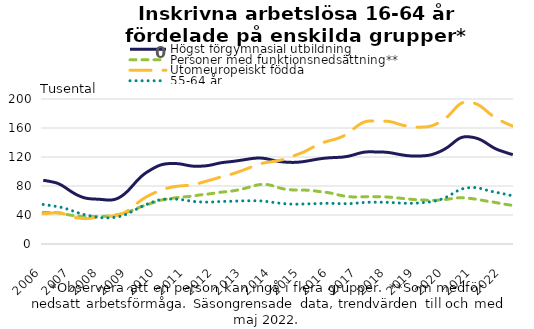
| Category | Högst förgymnasial utbildning | Personer med funktionsnedsättning** | Utomeuropeiskt födda | 55-64 år |
|---|---|---|---|---|
| 2006 | 87.802 | 43.582 | 41.833 | 54.537 |
| 2006-02 | 87.373 | 43.578 | 42.025 | 54.119 |
| 2006-03 | 86.816 | 43.552 | 42.259 | 53.616 |
| 2006-04 | 86.18 | 43.529 | 42.538 | 53.073 |
| 2006-05 | 85.501 | 43.503 | 42.864 | 52.537 |
| 2006-06 | 84.723 | 43.41 | 43.159 | 52.028 |
| 2006-07 | 83.674 | 43.141 | 43.237 | 51.506 |
| 2006-08 | 82.23 | 42.648 | 42.929 | 50.903 |
| 2006-09 | 80.421 | 41.984 | 42.222 | 50.17 |
| 2006-10 | 78.326 | 41.245 | 41.193 | 49.29 |
| 2006-11 | 76.077 | 40.556 | 39.992 | 48.277 |
| 2006-12 | 73.823 | 39.994 | 38.778 | 47.161 |
| 2007 | 71.665 | 39.554 | 37.694 | 45.989 |
| 2007-02 | 69.674 | 39.162 | 36.803 | 44.809 |
| 2007-03 | 67.9 | 38.759 | 36.116 | 43.659 |
| 2007-04 | 66.349 | 38.344 | 35.61 | 42.586 |
| 2007-05 | 65.012 | 37.966 | 35.243 | 41.606 |
| 2007-06 | 63.919 | 37.704 | 35.027 | 40.72 |
| 2007-07 | 63.115 | 37.611 | 35.015 | 39.928 |
| 2007-08 | 62.586 | 37.68 | 35.25 | 39.202 |
| 2007-09 | 62.268 | 37.84 | 35.718 | 38.525 |
| 2007-10 | 62.072 | 38.003 | 36.331 | 37.883 |
| 2007-11 | 61.924 | 38.091 | 36.983 | 37.283 |
| 2007-12 | 61.752 | 38.107 | 37.563 | 36.763 |
| 2008 | 61.51 | 38.112 | 37.986 | 36.371 |
| 2008-02 | 61.203 | 38.171 | 38.219 | 36.126 |
| 2008-03 | 60.872 | 38.317 | 38.299 | 36.021 |
| 2008-04 | 60.631 | 38.546 | 38.31 | 36.034 |
| 2008-05 | 60.62 | 38.854 | 38.379 | 36.154 |
| 2008-06 | 60.946 | 39.244 | 38.6 | 36.389 |
| 2008-07 | 61.681 | 39.736 | 39.031 | 36.757 |
| 2008-08 | 62.883 | 40.344 | 39.71 | 37.294 |
| 2008-09 | 64.557 | 41.073 | 40.658 | 38.033 |
| 2008-10 | 66.697 | 41.917 | 41.911 | 38.99 |
| 2008-11 | 69.277 | 42.866 | 43.5 | 40.17 |
| 2008-12 | 72.261 | 43.908 | 45.428 | 41.546 |
| 2009 | 75.613 | 45.037 | 47.687 | 43.079 |
| 2009-02 | 79.248 | 46.264 | 50.224 | 44.731 |
| 2009-03 | 83.018 | 47.586 | 52.926 | 46.461 |
| 2009-04 | 86.732 | 48.969 | 55.65 | 48.207 |
| 2009-05 | 90.209 | 50.343 | 58.265 | 49.904 |
| 2009-06 | 93.324 | 51.63 | 60.676 | 51.501 |
| 2009-07 | 96.038 | 52.801 | 62.856 | 52.988 |
| 2009-08 | 98.405 | 53.877 | 64.831 | 54.384 |
| 2009-09 | 100.546 | 54.926 | 66.644 | 55.72 |
| 2009-10 | 102.546 | 56.007 | 68.339 | 57.015 |
| 2009-11 | 104.434 | 57.142 | 69.923 | 58.252 |
| 2009-12 | 106.184 | 58.283 | 71.407 | 59.391 |
| 2010 | 107.706 | 59.353 | 72.784 | 60.366 |
| 2010-02 | 108.924 | 60.284 | 74.047 | 61.113 |
| 2010-03 | 109.822 | 61.046 | 75.203 | 61.619 |
| 2010-04 | 110.424 | 61.665 | 76.252 | 61.912 |
| 2010-05 | 110.787 | 62.195 | 77.172 | 62.044 |
| 2010-06 | 110.977 | 62.692 | 77.963 | 62.071 |
| 2010-07 | 111.053 | 63.188 | 78.636 | 62.03 |
| 2010-08 | 111.016 | 63.675 | 79.194 | 61.93 |
| 2010-09 | 110.831 | 64.115 | 79.644 | 61.754 |
| 2010-10 | 110.478 | 64.483 | 80.004 | 61.483 |
| 2010-11 | 109.963 | 64.785 | 80.292 | 61.094 |
| 2010-12 | 109.32 | 65.052 | 80.534 | 60.596 |
| 2011 | 108.638 | 65.324 | 80.762 | 60.036 |
| 2011-02 | 108.016 | 65.638 | 81.035 | 59.48 |
| 2011-03 | 107.541 | 66.019 | 81.423 | 58.981 |
| 2011-04 | 107.271 | 66.47 | 81.989 | 58.576 |
| 2011-05 | 107.194 | 66.963 | 82.751 | 58.281 |
| 2011-06 | 107.253 | 67.453 | 83.66 | 58.085 |
| 2011-07 | 107.387 | 67.894 | 84.636 | 57.951 |
| 2011-08 | 107.581 | 68.279 | 85.621 | 57.853 |
| 2011-09 | 107.877 | 68.646 | 86.583 | 57.792 |
| 2011-10 | 108.315 | 69.036 | 87.512 | 57.784 |
| 2011-11 | 108.913 | 69.466 | 88.428 | 57.853 |
| 2011-12 | 109.646 | 69.937 | 89.362 | 58.005 |
| 2012 | 110.443 | 70.435 | 90.331 | 58.209 |
| 2012-02 | 111.215 | 70.917 | 91.319 | 58.426 |
| 2012-03 | 111.886 | 71.348 | 92.29 | 58.612 |
| 2012-04 | 112.412 | 71.712 | 93.212 | 58.738 |
| 2012-05 | 112.812 | 72.036 | 94.082 | 58.806 |
| 2012-06 | 113.155 | 72.371 | 94.945 | 58.851 |
| 2012-07 | 113.5 | 72.758 | 95.841 | 58.911 |
| 2012-08 | 113.884 | 73.219 | 96.789 | 59.011 |
| 2012-09 | 114.305 | 73.754 | 97.82 | 59.138 |
| 2012-10 | 114.755 | 74.355 | 98.94 | 59.269 |
| 2012-11 | 115.241 | 75.03 | 100.128 | 59.387 |
| 2012-12 | 115.753 | 75.783 | 101.334 | 59.476 |
| 2013 | 116.275 | 76.612 | 102.529 | 59.533 |
| 2013-02 | 116.799 | 77.512 | 103.728 | 59.563 |
| 2013-03 | 117.312 | 78.473 | 104.967 | 59.584 |
| 2013-04 | 117.794 | 79.444 | 106.254 | 59.616 |
| 2013-05 | 118.203 | 80.359 | 107.557 | 59.646 |
| 2013-06 | 118.473 | 81.147 | 108.803 | 59.641 |
| 2013-07 | 118.567 | 81.759 | 109.933 | 59.568 |
| 2013-08 | 118.473 | 82.161 | 110.91 | 59.404 |
| 2013-09 | 118.175 | 82.314 | 111.694 | 59.136 |
| 2013-10 | 117.679 | 82.181 | 112.304 | 58.766 |
| 2013-11 | 117.006 | 81.736 | 112.817 | 58.315 |
| 2013-12 | 116.227 | 81.004 | 113.316 | 57.828 |
| 2014 | 115.441 | 80.063 | 113.855 | 57.362 |
| 2014-02 | 114.722 | 79.009 | 114.432 | 56.937 |
| 2014-03 | 114.115 | 77.961 | 115.034 | 56.552 |
| 2014-04 | 113.634 | 77.022 | 115.686 | 56.192 |
| 2014-05 | 113.264 | 76.254 | 116.438 | 55.853 |
| 2014-06 | 112.984 | 75.664 | 117.329 | 55.541 |
| 2014-07 | 112.774 | 75.214 | 118.371 | 55.274 |
| 2014-08 | 112.627 | 74.865 | 119.544 | 55.073 |
| 2014-09 | 112.566 | 74.601 | 120.818 | 54.96 |
| 2014-10 | 112.608 | 74.413 | 122.127 | 54.937 |
| 2014-11 | 112.756 | 74.306 | 123.402 | 54.975 |
| 2014-12 | 113.017 | 74.275 | 124.646 | 55.049 |
| 2015 | 113.381 | 74.293 | 125.936 | 55.134 |
| 2015-02 | 113.839 | 74.319 | 127.353 | 55.218 |
| 2015-03 | 114.375 | 74.278 | 128.945 | 55.298 |
| 2015-04 | 114.961 | 74.107 | 130.68 | 55.378 |
| 2015-05 | 115.573 | 73.797 | 132.488 | 55.464 |
| 2015-06 | 116.176 | 73.381 | 134.29 | 55.561 |
| 2015-07 | 116.745 | 72.928 | 136.004 | 55.668 |
| 2015-08 | 117.263 | 72.487 | 137.563 | 55.782 |
| 2015-09 | 117.73 | 72.08 | 138.935 | 55.9 |
| 2015-10 | 118.143 | 71.699 | 140.124 | 56.013 |
| 2015-11 | 118.5 | 71.302 | 141.162 | 56.1 |
| 2015-12 | 118.79 | 70.82 | 142.093 | 56.13 |
| 2016 | 119.01 | 70.216 | 142.951 | 56.092 |
| 2016-02 | 119.18 | 69.492 | 143.809 | 56.003 |
| 2016-03 | 119.324 | 68.694 | 144.746 | 55.89 |
| 2016-04 | 119.472 | 67.894 | 145.816 | 55.779 |
| 2016-05 | 119.656 | 67.148 | 147.064 | 55.689 |
| 2016-06 | 119.925 | 66.497 | 148.533 | 55.635 |
| 2016-07 | 120.325 | 65.953 | 150.279 | 55.623 |
| 2016-08 | 120.879 | 65.521 | 152.34 | 55.654 |
| 2016-09 | 121.59 | 65.194 | 154.699 | 55.735 |
| 2016-10 | 122.443 | 64.965 | 157.282 | 55.88 |
| 2016-11 | 123.398 | 64.843 | 159.959 | 56.103 |
| 2016-12 | 124.383 | 64.825 | 162.546 | 56.399 |
| 2017 | 125.308 | 64.89 | 164.862 | 56.727 |
| 2017-02 | 126.087 | 65.013 | 166.771 | 57.045 |
| 2017-03 | 126.657 | 65.153 | 168.187 | 57.318 |
| 2017-04 | 126.996 | 65.266 | 169.113 | 57.514 |
| 2017-05 | 127.133 | 65.327 | 169.609 | 57.628 |
| 2017-06 | 127.132 | 65.347 | 169.779 | 57.676 |
| 2017-07 | 127.067 | 65.342 | 169.739 | 57.681 |
| 2017-08 | 127.007 | 65.324 | 169.62 | 57.673 |
| 2017-09 | 126.965 | 65.296 | 169.519 | 57.662 |
| 2017-10 | 126.904 | 65.24 | 169.458 | 57.637 |
| 2017-11 | 126.78 | 65.133 | 169.409 | 57.592 |
| 2017-12 | 126.565 | 64.963 | 169.322 | 57.523 |
| 2018 | 126.245 | 64.735 | 169.106 | 57.424 |
| 2018-02 | 125.804 | 64.455 | 168.645 | 57.281 |
| 2018-03 | 125.236 | 64.146 | 167.883 | 57.088 |
| 2018-04 | 124.585 | 63.832 | 166.886 | 56.867 |
| 2018-05 | 123.926 | 63.524 | 165.809 | 56.648 |
| 2018-06 | 123.31 | 63.214 | 164.794 | 56.447 |
| 2018-07 | 122.753 | 62.895 | 163.915 | 56.282 |
| 2018-08 | 122.27 | 62.566 | 163.185 | 56.165 |
| 2018-09 | 121.875 | 62.223 | 162.582 | 56.101 |
| 2018-10 | 121.588 | 61.88 | 162.092 | 56.101 |
| 2018-11 | 121.407 | 61.557 | 161.7 | 56.162 |
| 2018-12 | 121.3 | 61.272 | 161.392 | 56.275 |
| 2019 | 121.27 | 61.041 | 161.193 | 56.446 |
| 2019-02 | 121.335 | 60.857 | 161.138 | 56.678 |
| 2019-03 | 121.492 | 60.711 | 161.213 | 56.95 |
| 2019-04 | 121.718 | 60.591 | 161.377 | 57.243 |
| 2019-05 | 122.018 | 60.479 | 161.628 | 57.556 |
| 2019-06 | 122.463 | 60.378 | 162.068 | 57.92 |
| 2019-07 | 123.162 | 60.313 | 162.858 | 58.384 |
| 2019-08 | 124.129 | 60.309 | 164.023 | 58.976 |
| 2019-09 | 125.315 | 60.383 | 165.493 | 59.705 |
| 2019-10 | 126.672 | 60.536 | 167.179 | 60.57 |
| 2019-11 | 128.174 | 60.756 | 169.027 | 61.59 |
| 2019-12 | 129.85 | 61.049 | 171.09 | 62.798 |
| 2020 | 131.762 | 61.417 | 173.493 | 64.221 |
| 2020-02 | 133.943 | 61.858 | 176.342 | 65.869 |
| 2020-03 | 136.425 | 62.353 | 179.695 | 67.728 |
| 2020-04 | 139.128 | 62.858 | 183.426 | 69.709 |
| 2020-05 | 141.828 | 63.313 | 187.191 | 71.663 |
| 2020-06 | 144.248 | 63.649 | 190.572 | 73.443 |
| 2020-07 | 146.117 | 63.805 | 193.176 | 74.92 |
| 2020-08 | 147.312 | 63.766 | 194.852 | 76.048 |
| 2020-09 | 147.888 | 63.57 | 195.703 | 76.866 |
| 2020-10 | 147.968 | 63.275 | 195.906 | 77.431 |
| 2020-11 | 147.71 | 62.931 | 195.658 | 77.785 |
| 2020-12 | 147.247 | 62.552 | 195.083 | 77.944 |
| 2021 | 146.6 | 62.119 | 194.176 | 77.89 |
| 2021-02 | 145.732 | 61.622 | 192.887 | 77.586 |
| 2021-03 | 144.557 | 61.055 | 191.141 | 77.018 |
| 2021-04 | 143.021 | 60.435 | 188.928 | 76.228 |
| 2021-05 | 141.166 | 59.812 | 186.374 | 75.307 |
| 2021-06 | 139.063 | 59.23 | 183.606 | 74.344 |
| 2021-07 | 136.854 | 58.704 | 180.785 | 73.428 |
| 2021-08 | 134.717 | 58.203 | 178.084 | 72.616 |
| 2021-09 | 132.765 | 57.686 | 175.598 | 71.906 |
| 2021-10 | 131.076 | 57.12 | 173.406 | 71.272 |
| 2021-11 | 129.667 | 56.504 | 171.538 | 70.669 |
| 2021-12 | 128.475 | 55.865 | 169.921 | 70.033 |
| 2022 | 127.38 | 55.246 | 168.408 | 69.331 |
| 2022-02 | 126.287 | 54.672 | 166.886 | 68.585 |
| 2022-03 | 125.193 | 54.158 | 165.367 | 67.837 |
| 2022-04 | 124.179 | 53.717 | 163.954 | 67.144 |
| 2022-05 | 123.333 | 53.387 | 162.78 | 66.559 |